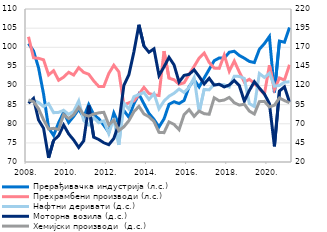
| Category | Прерађивачка индустрија (л.с.) | Прехрамбени производи (л.с.) |
|---|---|---|
| 2008. | 100.969 | 102.741 |
| II | 99.031 | 97.259 |
| III | 94.635 | 97.109 |
| IV | 87.766 | 96.715 |
| 2009. | 78.923 | 92.764 |
| II | 76.927 | 93.876 |
| III | 80.273 | 91.367 |
| IV | 82.995 | 92.186 |
| 2010. | 80.321 | 93.462 |
| II | 81.929 | 92.737 |
| III | 83.822 | 94.65 |
| IV | 81.702 | 93.434 |
| 2011. | 85.031 | 92.939 |
| II | 82.353 | 91.191 |
| III | 81.307 | 89.747 |
| IV | 79.595 | 89.752 |
| 2012. | 77.737 | 93.154 |
| II | 82.81 | 95.294 |
| III | 79.836 | 93.556 |
| IV | 83.455 | 84.956 |
| 2013. | 81.697 | 85.466 |
| II | 85.208 | 85.966 |
| III | 87.729 | 87.693 |
| IV | 85.199 | 89.509 |
| 2014. | 82.71 | 87.919 |
| II | 81.127 | 87.555 |
| III | 79.166 | 87.381 |
| IV | 81.263 | 98.993 |
| 2015. | 85.102 | 91.914 |
| II | 85.756 | 91.502 |
| III | 85.287 | 90.314 |
| IV | 86.087 | 90.709 |
| 2016. | 89.694 | 92.906 |
| II | 91.518 | 94.986 |
| III | 89.623 | 97.172 |
| IV | 91.945 | 98.494 |
| 2017. | 94.228 | 96.032 |
| II | 96.483 | 94.548 |
| III | 97.201 | 94.479 |
| IV | 97.131 | 97.956 |
| 2018. | 98.696 | 93.722 |
| II | 98.953 | 96.403 |
| III | 97.861 | 93.539 |
| IV | 97.135 | 90.876 |
| 2019. | 96.293 | 91.63 |
| II | 95.999 | 90.541 |
| III | 99.472 | 89.031 |
| IV | 100.947 | 87.728 |
| 2020. | 102.797 | 95.288 |
| II | 88.178 | 88.984 |
| III | 101.606 | 91.978 |
| IV | 101.309 | 91.42 |
| 2021. | 105.153 | 95.422 |